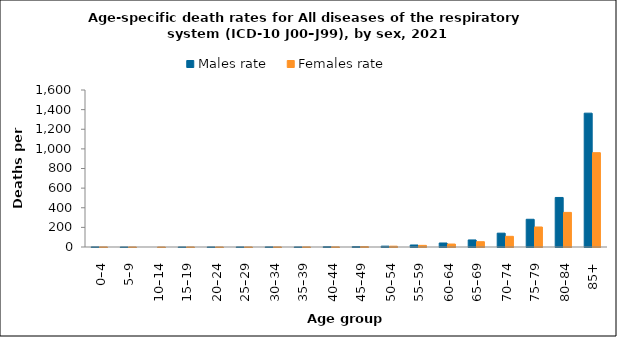
| Category | Males rate | Females rate |
|---|---|---|
| 0–4 | 1.159 | 0.818 |
| 5–9 | 0.241 | 0.382 |
| 10–14 | 0 | 0.127 |
| 15–19 | 0.394 | 0.557 |
| 20–24 | 0.478 | 0.254 |
| 25–29 | 0.653 | 0.443 |
| 30–34 | 1.17 | 0.834 |
| 35–39 | 0.754 | 1.065 |
| 40–44 | 3.187 | 1.312 |
| 45–49 | 4.527 | 4.563 |
| 50–54 | 8.688 | 8.197 |
| 55–59 | 20.458 | 16.625 |
| 60–64 | 40.917 | 30.245 |
| 65–69 | 71.899 | 54.029 |
| 70–74 | 140.979 | 108.6 |
| 75–79 | 282.589 | 203.886 |
| 80–84 | 504.877 | 352.687 |
| 85+ | 1363.874 | 961.459 |